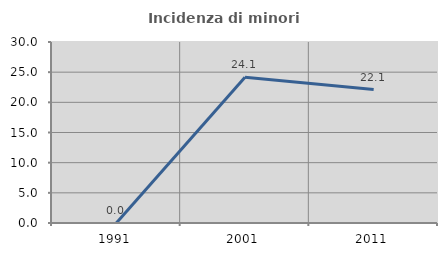
| Category | Incidenza di minori stranieri |
|---|---|
| 1991.0 | 0 |
| 2001.0 | 24.138 |
| 2011.0 | 22.115 |